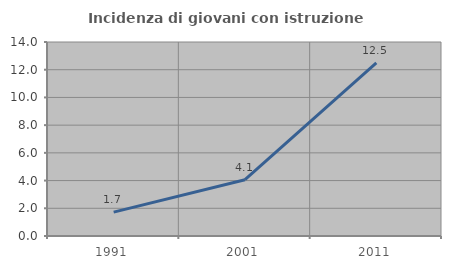
| Category | Incidenza di giovani con istruzione universitaria |
|---|---|
| 1991.0 | 1.724 |
| 2001.0 | 4.065 |
| 2011.0 | 12.5 |